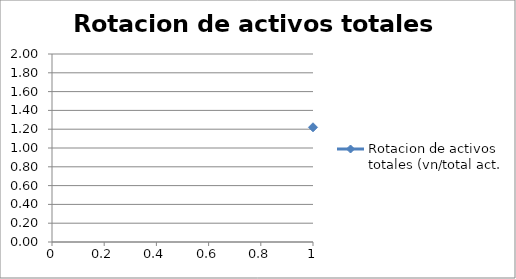
| Category | Rotacion de activos totales (vn/total act. |
|---|---|
| 0 | 1.221 |
| 1 | 1.205 |
| 2 | 1.095 |
| 3 | 1.191 |
| 4 | 0.962 |
| 5 | 1.234 |
| 6 | 1.099 |
| 7 | 1.761 |